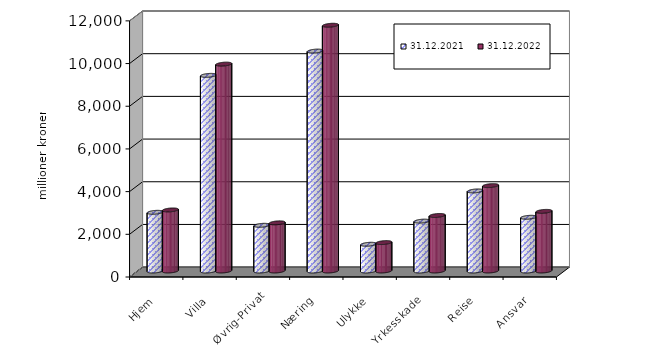
| Category | 31.12.2021 | 31.12.2022 |
|---|---|---|
| Hjem | 2749.368 | 2860.361 |
| Villa | 9165.907 | 9692.271 |
| Øvrig-Privat | 2140.915 | 2256.018 |
| Næring | 10302.974 | 11513.118 |
| Ulykke | 1252.363 | 1331.244 |
| Yrkesskade | 2336.184 | 2600.673 |
| Reise | 3750.307 | 3999.952 |
| Ansvar | 2516.224 | 2793.543 |